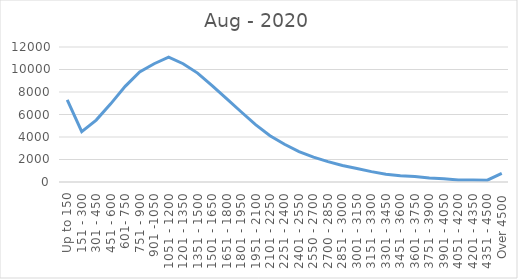
| Category | Aug - 2020 |
|---|---|
| Up to 150 | 7294 |
| 151 - 300 | 4473 |
| 301 - 450 | 5503 |
| 451 - 600 | 6946 |
| 601- 750 | 8505 |
| 751 - 900 | 9773 |
| 901 -1050 | 10512 |
| 1051 - 1200 | 11096 |
| 1201 - 1350 | 10511 |
| 1351 - 1500 | 9680 |
| 1501 - 1650 | 8569 |
| 1651 - 1800 | 7402 |
| 1801 - 1950 | 6244 |
| 1951 - 2100 | 5096 |
| 2101 - 2250 | 4118 |
| 2251 - 2400 | 3355 |
| 2401 - 2550 | 2699 |
| 2550 - 2700 | 2210 |
| 2700 - 2850 | 1806 |
| 2851 - 3000 | 1464 |
| 3001 - 3150 | 1202 |
| 3151 - 3300 | 921 |
| 3301 - 3450 | 688 |
| 3451 - 3600 | 556 |
| 3601 - 3750 | 483 |
| 3751 - 3900 | 349 |
| 3901 - 4050 | 286 |
| 4051 - 4200 | 185 |
| 4201 - 4350 | 185 |
| 4351 - 4500 | 162 |
| Over 4500 | 759 |